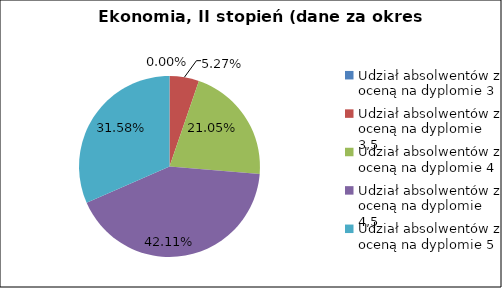
| Category | Series 0 |
|---|---|
| Udział absolwentów z oceną na dyplomie 3 | 0 |
| Udział absolwentów z oceną na dyplomie 3,5 | 5.263 |
| Udział absolwentów z oceną na dyplomie 4 | 21.053 |
| Udział absolwentów z oceną na dyplomie 4,5 | 42.105 |
| Udział absolwentów z oceną na dyplomie 5 | 31.579 |